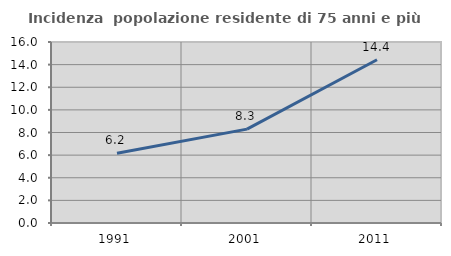
| Category | Incidenza  popolazione residente di 75 anni e più |
|---|---|
| 1991.0 | 6.171 |
| 2001.0 | 8.298 |
| 2011.0 | 14.431 |